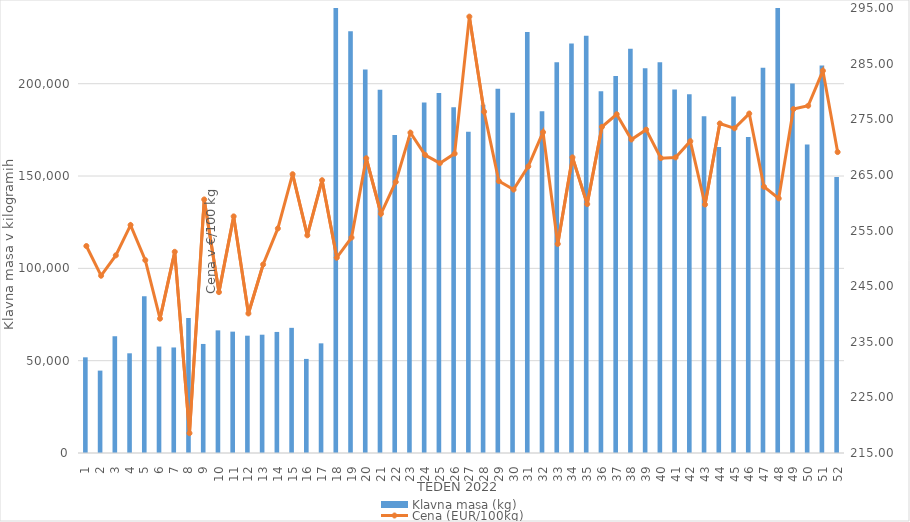
| Category | Klavna masa (kg) |
|---|---|
| 1.0 | 51818 |
| 2.0 | 44619 |
| 3.0 | 63233 |
| 4.0 | 53993 |
| 5.0 | 84871 |
| 6.0 | 57648 |
| 7.0 | 57159 |
| 8.0 | 73139 |
| 9.0 | 59056 |
| 10.0 | 66417 |
| 11.0 | 65723 |
| 12.0 | 63530 |
| 13.0 | 64069 |
| 14.0 | 65564 |
| 15.0 | 67787 |
| 16.0 | 50958 |
| 17.0 | 59387 |
| 18.0 | 241833 |
| 19.0 | 228389 |
| 20.0 | 207661 |
| 21.0 | 196732 |
| 22.0 | 172190 |
| 23.0 | 170751 |
| 24.0 | 189775 |
| 25.0 | 195029 |
| 26.0 | 187239 |
| 27.0 | 173967 |
| 28.0 | 188601 |
| 29.0 | 197293 |
| 30.0 | 184259 |
| 31.0 | 228023 |
| 32.0 | 185079 |
| 33.0 | 211612 |
| 34.0 | 221748 |
| 35.0 | 225927 |
| 36.0 | 195924 |
| 37.0 | 204224 |
| 38.0 | 218966 |
| 39.0 | 208403 |
| 40.0 | 211635 |
| 41.0 | 196841 |
| 42.0 | 194271 |
| 43.0 | 182399 |
| 44.0 | 165696 |
| 45.0 | 193022 |
| 46.0 | 171172 |
| 47.0 | 208597 |
| 48.0 | 253151 |
| 49.0 | 200117 |
| 50.0 | 167119 |
| 51.0 | 209797 |
| 52.0 | 149439 |